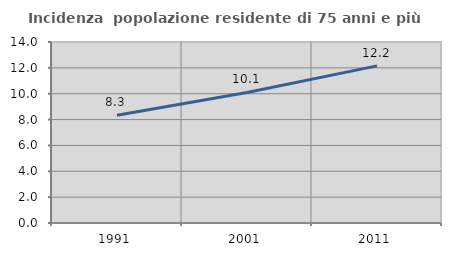
| Category | Incidenza  popolazione residente di 75 anni e più |
|---|---|
| 1991.0 | 8.332 |
| 2001.0 | 10.095 |
| 2011.0 | 12.154 |